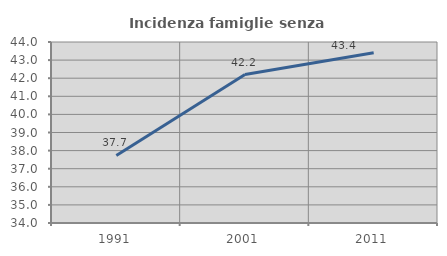
| Category | Incidenza famiglie senza nuclei |
|---|---|
| 1991.0 | 37.731 |
| 2001.0 | 42.199 |
| 2011.0 | 43.411 |